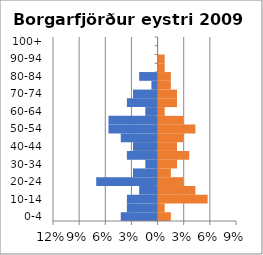
| Category | % Men | % Women |
|---|---|---|
| 0-4 | -0.042 | 0.014 |
| 5-9 | -0.035 | 0.007 |
| 10-14 | -0.035 | 0.056 |
| 15-19 | -0.021 | 0.042 |
| 20-24 | -0.07 | 0.028 |
| 25-29 | -0.028 | 0.014 |
| 30-34 | -0.014 | 0.021 |
| 35-39 | -0.035 | 0.035 |
| 40-44 | -0.028 | 0.021 |
| 45-49 | -0.042 | 0.028 |
| 50-54 | -0.056 | 0.042 |
| 55-59 | -0.056 | 0.028 |
| 60-64 | -0.014 | 0.007 |
| 65-69 | -0.035 | 0.021 |
| 70-74 | -0.028 | 0.021 |
| 75-79 | -0.007 | 0.014 |
| 80-84 | -0.021 | 0.014 |
| 85-89 | 0 | 0.007 |
| 90-94 | 0 | 0.007 |
| 95-99 | 0 | 0 |
| 100+ | 0 | 0 |